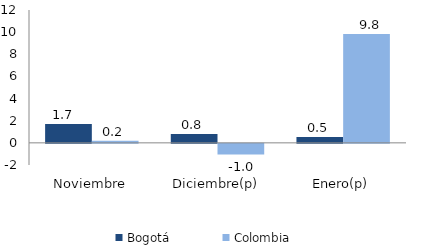
| Category | Bogotá | Colombia |
|---|---|---|
| Noviembre | 1.705 | 0.191 |
| Diciembre(p) | 0.794 | -0.96 |
| Enero(p) | 0.521 | 9.837 |